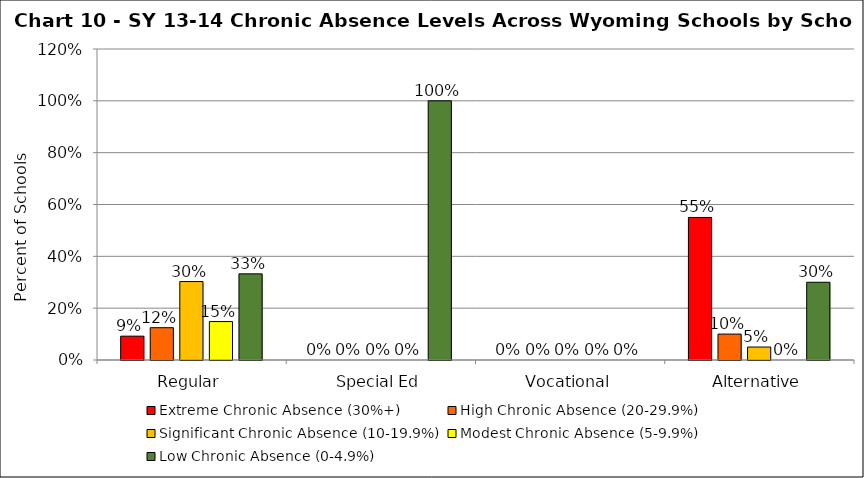
| Category | Extreme Chronic Absence (30%+) | High Chronic Absence (20-29.9%) | Significant Chronic Absence (10-19.9%) | Modest Chronic Absence (5-9.9%) | Low Chronic Absence (0-4.9%) |
|---|---|---|---|---|---|
| 0 | 0.092 | 0.125 | 0.303 | 0.148 | 0.332 |
| 1 | 0 | 0 | 0 | 0 | 1 |
| 2 | 0 | 0 | 0 | 0 | 0 |
| 3 | 0.55 | 0.1 | 0.05 | 0 | 0.3 |